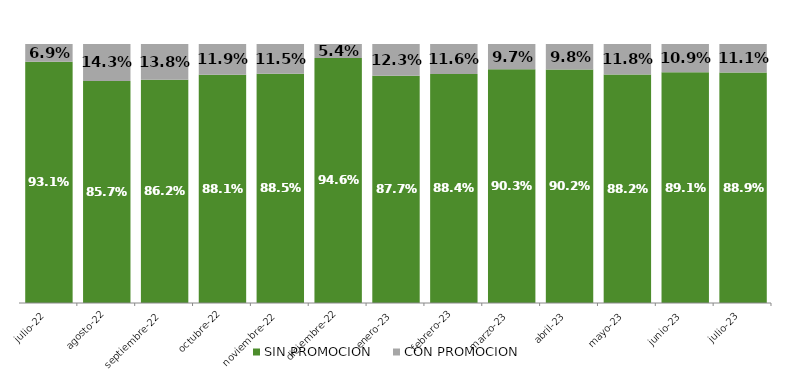
| Category | SIN PROMOCION   | CON PROMOCION   |
|---|---|---|
| 2022-07-01 | 0.931 | 0.069 |
| 2022-08-01 | 0.857 | 0.143 |
| 2022-09-01 | 0.862 | 0.138 |
| 2022-10-01 | 0.881 | 0.119 |
| 2022-11-01 | 0.885 | 0.115 |
| 2022-12-01 | 0.946 | 0.054 |
| 2023-01-01 | 0.877 | 0.123 |
| 2023-02-01 | 0.884 | 0.116 |
| 2023-03-01 | 0.903 | 0.097 |
| 2023-04-01 | 0.902 | 0.098 |
| 2023-05-01 | 0.882 | 0.118 |
| 2023-06-01 | 0.891 | 0.109 |
| 2023-07-01 | 0.889 | 0.111 |